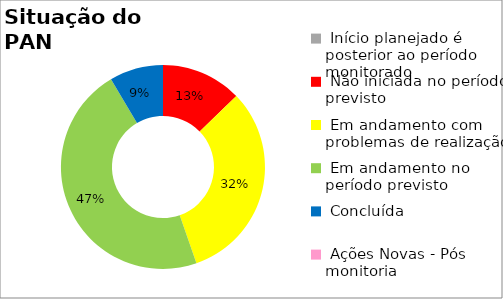
| Category | Series 0 |
|---|---|
|  Início planejado é posterior ao período monitorado | 0 |
|  Não iniciada no período previsto | 0.128 |
|  Em andamento com problemas de realização | 0.319 |
|  Em andamento no período previsto  | 0.468 |
|  Concluída | 0.085 |
|  Ações Novas - Pós monitoria | 0 |